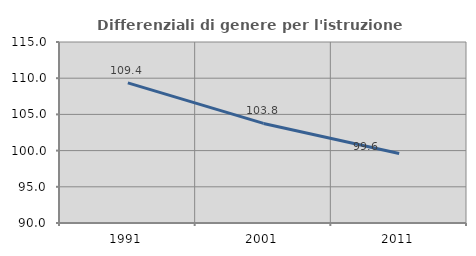
| Category | Differenziali di genere per l'istruzione superiore |
|---|---|
| 1991.0 | 109.359 |
| 2001.0 | 103.755 |
| 2011.0 | 99.61 |